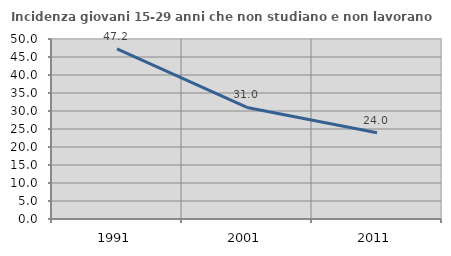
| Category | Incidenza giovani 15-29 anni che non studiano e non lavorano  |
|---|---|
| 1991.0 | 47.235 |
| 2001.0 | 30.985 |
| 2011.0 | 23.98 |